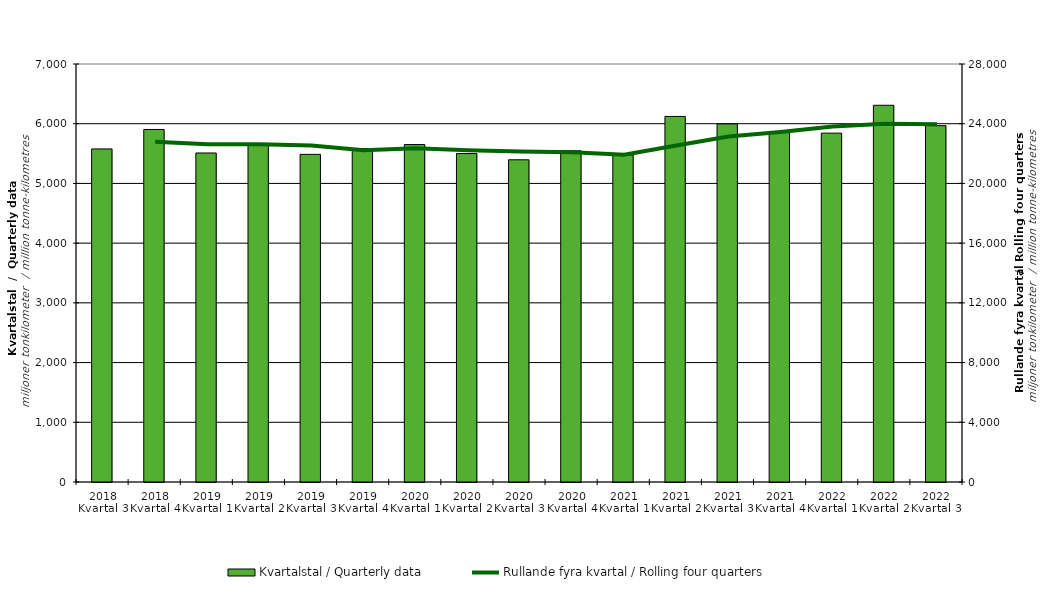
| Category | Kvartalstal / Quarterly data |
|---|---|
| 2018 Kvartal 3 | 5577.634 |
| 2018 Kvartal 4 | 5903.543 |
| 2019 Kvartal 1 | 5509.773 |
| 2019 Kvartal 2 | 5641.612 |
| 2019 Kvartal 3 | 5486.395 |
| 2019 Kvartal 4 | 5584.286 |
| 2020 Kvartal 1 | 5650.915 |
| 2020 Kvartal 2 | 5500.334 |
| 2020 Kvartal 3 | 5395.987 |
| 2020 Kvartal 4 | 5546.662 |
| 2021 Kvartal 1 | 5476.427 |
| 2021 Kvartal 2 | 6121.807 |
| 2021 Kvartal 3 | 5996.688 |
| 2021 Kvartal 4 | 5853.966 |
| 2022 Kvartal 1 | 5841.994 |
| 2022 Kvartal 2 | 6308.848 |
| 2022 Kvartal 3 | 5967.37 |